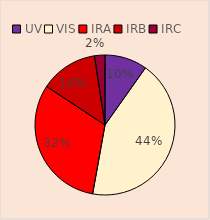
| Category | Series 0 |
|---|---|
| UV | 0.1 |
| VIS | 0.44 |
| IRA | 0.322 |
| IRB | 0.136 |
| IRC | 0.025 |